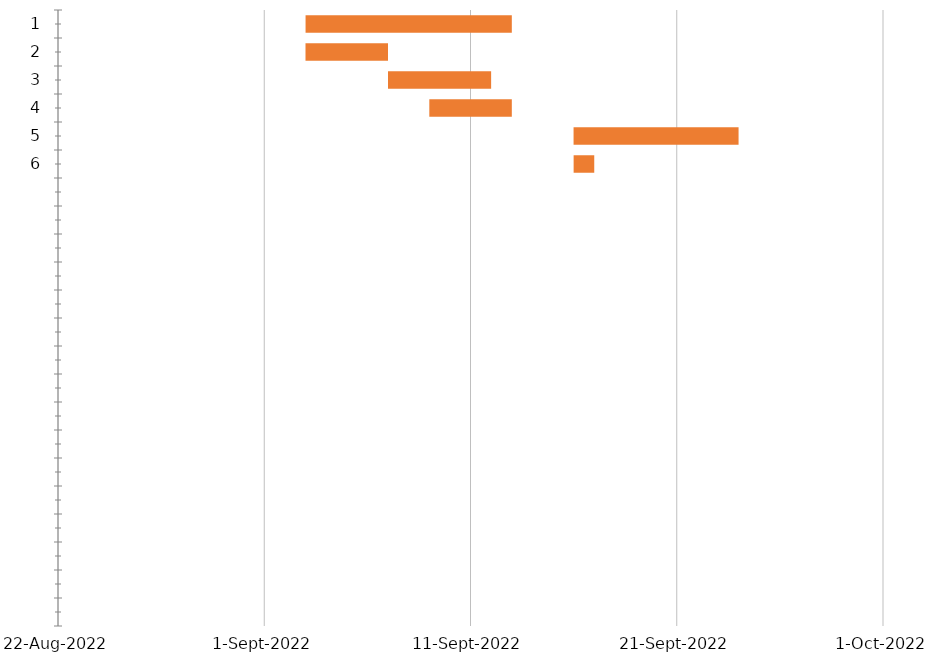
| Category | START | DAUER |
|---|---|---|
| 1.0 | 2022-09-03 | 10 |
| 2.0 | 2022-09-03 | 4 |
| 3.0 | 2022-09-07 | 5 |
| 4.0 | 2022-09-09 | 4 |
| 5.0 | 2022-09-16 | 8 |
| 6.0 | 2022-09-16 | 1 |
| nan | 2022-09-16 | 0 |
| nan | 2022-09-16 | 0 |
| nan | 2022-09-16 | 0 |
| nan | 2022-09-16 | 0 |
| nan | 2022-09-16 | 0 |
| nan | 2022-09-16 | 0 |
| nan | 2022-09-16 | 0 |
| nan | 2022-09-16 | 0 |
| nan | 2022-09-16 | 0 |
| nan | 2022-09-16 | 0 |
| nan | 2022-09-16 | 0 |
| nan | 2022-09-16 | 0 |
| nan | 2022-09-16 | 0 |
| nan | 2022-09-16 | 0 |
| nan | 2022-09-16 | 0 |
| nan | 2022-09-16 | 0 |